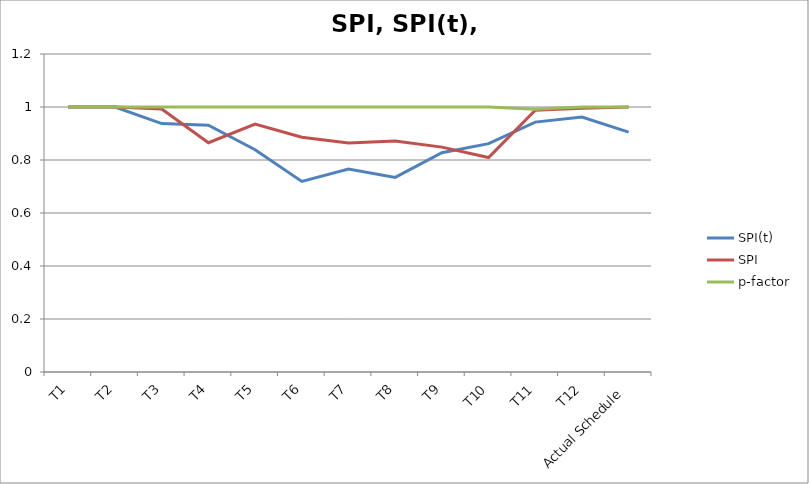
| Category | SPI(t) | SPI | p-factor |
|---|---|---|---|
| T1 | 1 | 1 | 1 |
| T2 | 1 | 1 | 1 |
| T3 | 0.938 | 0.993 | 1 |
| T4 | 0.932 | 0.865 | 1 |
| T5 | 0.839 | 0.935 | 1 |
| T6 | 0.719 | 0.886 | 1 |
| T7 | 0.766 | 0.864 | 1 |
| T8 | 0.734 | 0.872 | 1 |
| T9 | 0.827 | 0.849 | 1 |
| T10 | 0.862 | 0.809 | 1 |
| T11 | 0.943 | 0.988 | 0.992 |
| T12 | 0.962 | 0.995 | 1 |
| Actual Schedule | 0.905 | 1 | 1 |